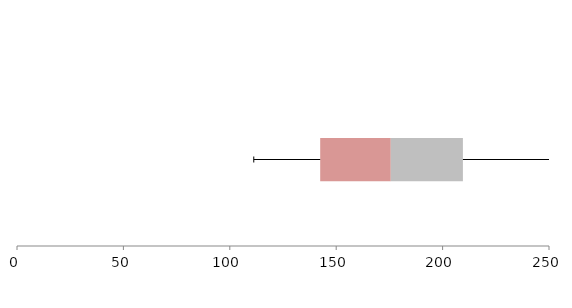
| Category | Series 1 | Series 2 | Series 3 |
|---|---|---|---|
| 0 | 142.478 | 33.175 | 33.886 |